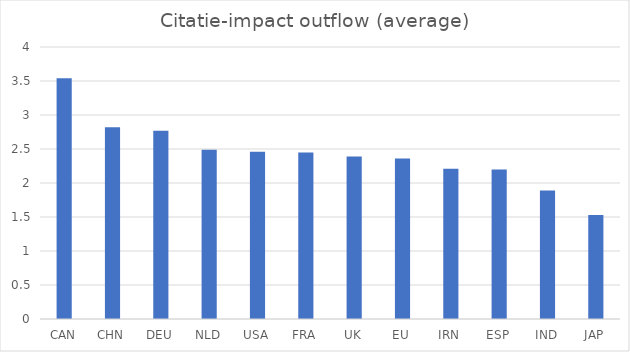
| Category | Citatie-impact outflow (average) |
|---|---|
| CAN | 3.54 |
| CHN | 2.82 |
| DEU | 2.77 |
| NLD | 2.49 |
| USA | 2.46 |
| FRA | 2.45 |
| UK | 2.39 |
| EU | 2.36 |
| IRN | 2.21 |
| ESP | 2.2 |
| IND | 1.89 |
| JAP | 1.53 |